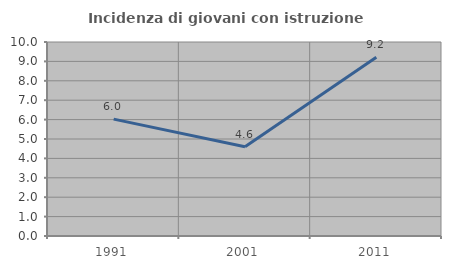
| Category | Incidenza di giovani con istruzione universitaria |
|---|---|
| 1991.0 | 6.024 |
| 2001.0 | 4.598 |
| 2011.0 | 9.211 |